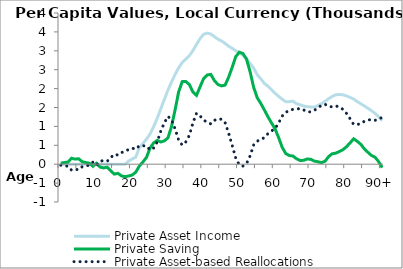
| Category | Private Asset Income | Private Saving | Private Asset-based Reallocations |
|---|---|---|---|
| 0 | 0 | 25.581 | -25.581 |
|  | 0 | 46.035 | -46.035 |
| 2 | 0 | 53.331 | -53.331 |
| 3 | 0 | 157.203 | -157.203 |
| 4 | 0 | 134.638 | -134.638 |
| 5 | 0 | 144.42 | -144.42 |
| 6 | 0 | 65.51 | -65.51 |
| 7 | 0 | 45.15 | -45.15 |
| 8 | 0 | 25.524 | -25.524 |
| 9 | 0 | -54.191 | 54.191 |
| 10 | 0 | 24.501 | -24.501 |
| 11 | 0 | -76.134 | 76.134 |
| 12 | 0 | -98.578 | 98.578 |
| 13 | 0 | -79.395 | 79.395 |
| 14 | 0 | -176.293 | 176.293 |
| 15 | 0 | -263.043 | 263.043 |
| 16 | 0 | -241.022 | 241.022 |
| 17 | 0 | -310.001 | 310.001 |
| 18 | 0 | -330.023 | 330.023 |
| 19 | 82.678 | -311.858 | 394.536 |
| 20 | 139.112 | -285.085 | 424.196 |
| 21 | 187.022 | -210.877 | 397.899 |
| 22 | 440.453 | -48.196 | 488.648 |
| 23 | 547.186 | 59.082 | 488.104 |
| 24 | 663.124 | 182.204 | 480.92 |
| 25 | 802.441 | 427.425 | 375.016 |
| 26 | 993.608 | 564.055 | 429.553 |
| 27 | 1215.538 | 629.08 | 586.458 |
| 28 | 1465.442 | 588.917 | 876.525 |
| 29 | 1713.497 | 616.792 | 1096.704 |
| 30 | 1959.135 | 695.715 | 1263.42 |
| 31 | 2174.907 | 992.666 | 1182.242 |
| 32 | 2371.874 | 1436.861 | 935.012 |
| 33 | 2550.197 | 1912.222 | 637.974 |
| 34 | 2689.918 | 2184.586 | 505.332 |
| 35 | 2778.39 | 2187.944 | 590.446 |
| 36 | 2868.939 | 2106.369 | 762.57 |
| 37 | 3004.559 | 1910.788 | 1093.771 |
| 38 | 3167.438 | 1820.931 | 1346.507 |
| 39 | 3323.265 | 2046.996 | 1276.269 |
| 40 | 3436.202 | 2267.302 | 1168.899 |
| 41 | 3466.755 | 2359.796 | 1106.96 |
| 42 | 3443.98 | 2375.655 | 1068.325 |
| 43 | 3375.149 | 2214.841 | 1160.308 |
| 44 | 3307.359 | 2109.341 | 1198.017 |
| 45 | 3261.691 | 2071.771 | 1189.92 |
| 46 | 3196.078 | 2092.511 | 1103.568 |
| 47 | 3120.787 | 2301.033 | 819.754 |
| 48 | 3064.612 | 2566.144 | 498.468 |
| 49 | 3002.694 | 2847.148 | 155.546 |
| 50 | 2946.237 | 2963.769 | -17.531 |
| 51 | 2879.311 | 2927.344 | -48.033 |
| 52 | 2797.361 | 2780.784 | 16.577 |
| 53 | 2666.79 | 2448.988 | 217.802 |
| 54 | 2543.935 | 2036.122 | 507.813 |
| 55 | 2369.51 | 1758.623 | 610.887 |
| 56 | 2258.919 | 1608.933 | 649.987 |
| 57 | 2139.271 | 1435.042 | 704.229 |
| 58 | 2062.276 | 1255.16 | 807.116 |
| 59 | 1972.884 | 1092.348 | 880.536 |
| 60 | 1877.643 | 935.338 | 942.305 |
| 61 | 1793.368 | 701.457 | 1091.911 |
| 62 | 1719.266 | 445.065 | 1274.201 |
| 63 | 1652.905 | 281.054 | 1371.851 |
| 64 | 1655.017 | 229.039 | 1425.978 |
| 65 | 1666.98 | 216.444 | 1450.536 |
| 66 | 1602.866 | 143.843 | 1459.023 |
| 67 | 1572.422 | 99.779 | 1472.643 |
| 68 | 1538.311 | 101.606 | 1436.705 |
| 69 | 1521.922 | 137.96 | 1383.962 |
| 70 | 1513.341 | 129.23 | 1384.111 |
| 71 | 1507.905 | 82.514 | 1425.391 |
| 72 | 1551.37 | 64.857 | 1486.513 |
| 73 | 1600.972 | 41.399 | 1559.573 |
| 74 | 1664.037 | 79.142 | 1584.894 |
| 75 | 1731.886 | 202.401 | 1529.485 |
| 76 | 1793.148 | 275.428 | 1517.719 |
| 77 | 1836.694 | 292.77 | 1543.924 |
| 78 | 1844.599 | 335.227 | 1509.372 |
| 79 | 1836.909 | 383.689 | 1453.221 |
| 80 | 1806.101 | 462.224 | 1343.877 |
| 81 | 1767.174 | 563.642 | 1203.533 |
| 82 | 1724.143 | 672.201 | 1051.942 |
| 83 | 1656.854 | 604.671 | 1052.183 |
| 84 | 1598.099 | 527.729 | 1070.369 |
| 85 | 1540.792 | 405.272 | 1135.52 |
| 86 | 1479.522 | 314.933 | 1164.588 |
| 87 | 1414.874 | 229.983 | 1184.891 |
| 88 | 1345.842 | 184.468 | 1161.373 |
| 89 | 1257.142 | 67.394 | 1189.748 |
| 90+ | 1150.779 | -91.17 | 1241.949 |